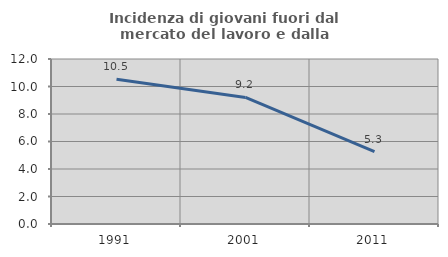
| Category | Incidenza di giovani fuori dal mercato del lavoro e dalla formazione  |
|---|---|
| 1991.0 | 10.526 |
| 2001.0 | 9.207 |
| 2011.0 | 5.263 |